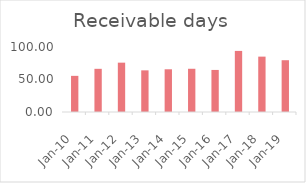
| Category | Receivable days (Lower is better) |
|---|---|
| 2010-03-31 | 55.602 |
| 2011-03-31 | 66.43 |
| 2012-03-31 | 75.909 |
| 2013-03-31 | 64.079 |
| 2014-03-31 | 65.72 |
| 2015-03-31 | 66.508 |
| 2016-03-31 | 64.71 |
| 2017-03-31 | 93.984 |
| 2018-03-31 | 85.191 |
| 2019-03-31 | 79.668 |